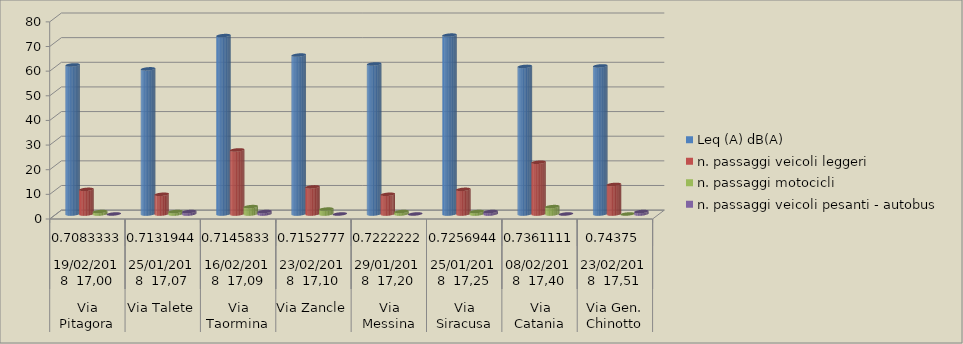
| Category | Leq (A) dB(A) | n. passaggi veicoli leggeri  | n. passaggi motocicli | n. passaggi veicoli pesanti - autobus  |
|---|---|---|---|---|
| 0 | 60.5 | 10 | 1 | 0 |
| 1 | 58.9 | 8 | 1 | 1 |
| 2 | 72.4 | 26 | 3 | 1 |
| 3 | 64.5 | 11 | 2 | 0 |
| 4 | 60.9 | 8 | 1 | 0 |
| 5 | 72.6 | 10 | 1 | 1 |
| 6 | 59.9 | 21 | 3 | 0 |
| 7 | 60.1 | 12 | 0 | 1 |